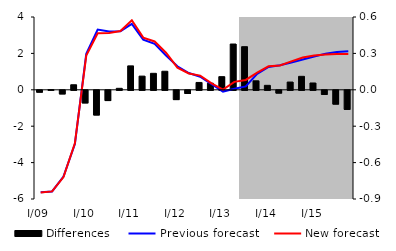
| Category | Differences |
|---|---|
| I/09 | -0.016 |
| II | 0.002 |
| III | -0.03 |
| IV | 0.042 |
| I/10 | -0.104 |
| II | -0.204 |
| III | -0.085 |
| IV | 0.012 |
| I/11 | 0.197 |
| II | 0.113 |
| III | 0.136 |
| IV | 0.153 |
| I/12 | -0.077 |
| II | -0.026 |
| III | 0.061 |
| IV | 0.055 |
| I/13 | 0.108 |
| II | 0.377 |
| III | 0.355 |
| IV | 0.074 |
| I/14 | 0.037 |
| II | -0.023 |
| III | 0.064 |
| IV | 0.111 |
| I/15 | 0.056 |
| II | -0.034 |
| III | -0.114 |
| IV | -0.157 |